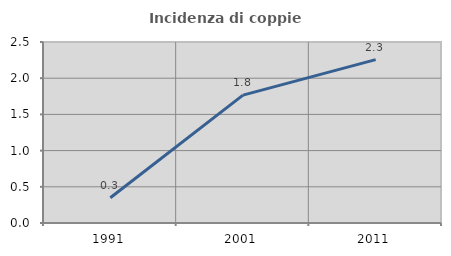
| Category | Incidenza di coppie miste |
|---|---|
| 1991.0 | 0.349 |
| 2001.0 | 1.767 |
| 2011.0 | 2.257 |